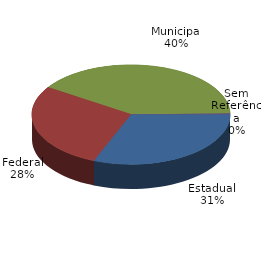
| Category | Qtde Acidentes |
|---|---|
| Estadual | 476 |
| Federal | 430 |
| Municipal | 619 |
| Sem Referência | 6 |